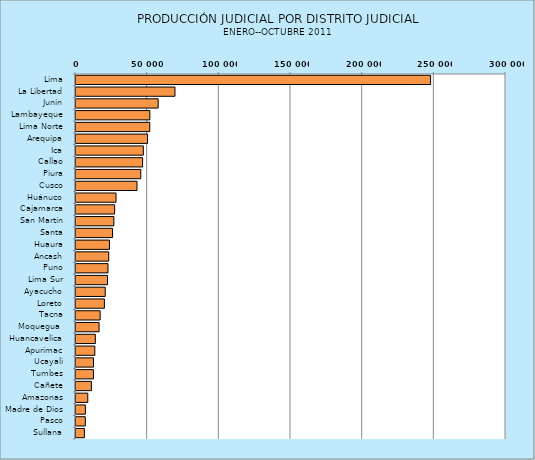
| Category | Series 0 |
|---|---|
| Lima | 247389 |
| La Libertad | 69045 |
| Junín | 57322 |
| Lambayeque | 51545 |
| Lima Norte | 51455 |
| Arequipa | 49937 |
| Ica | 46978 |
| Callao | 46457 |
| Piura | 45192 |
| Cusco | 42557 |
| Huánuco | 27932 |
| Cajamarca | 26950 |
| San Martín | 26418 |
| Santa | 25529 |
| Huaura | 23352 |
| Ancash | 22837 |
| Puno | 22305 |
| Lima Sur | 21979 |
| Ayacucho | 20389 |
| Loreto | 19808 |
| Tacna | 16838 |
| Moquegua  | 16094 |
| Huancavelica | 13492 |
| Apurimac | 13141 |
| Ucayali | 12226 |
| Tumbes | 12174 |
| Cañete | 10738 |
| Amazonas | 8230 |
| Madre de Dios | 6550 |
| Pasco | 6502 |
| Sullana | 5862 |